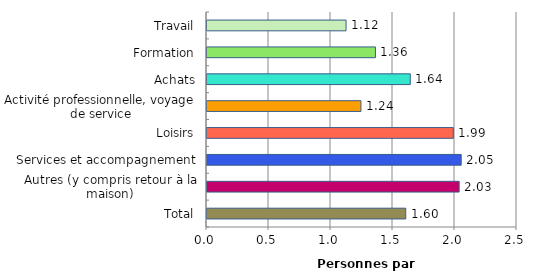
| Category | Series 0 |
|---|---|
| Travail | 1.121 |
| Formation | 1.358 |
| Achats | 1.639 |
| Activité professionnelle, voyage de service | 1.242 |
| Loisirs | 1.986 |
| Services et accompagnement | 2.05 |
| Autres (y compris retour à la maison) | 2.034 |
| Total | 1.603 |